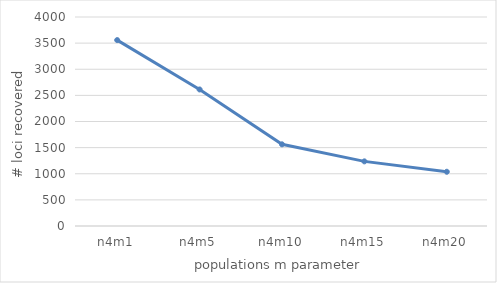
| Category | n4m1 |
|---|---|
| n4m1 | 3558 |
| n4m5 | 2613 |
| n4m10 | 1563 |
| n4m15 | 1237 |
| n4m20 | 1038 |